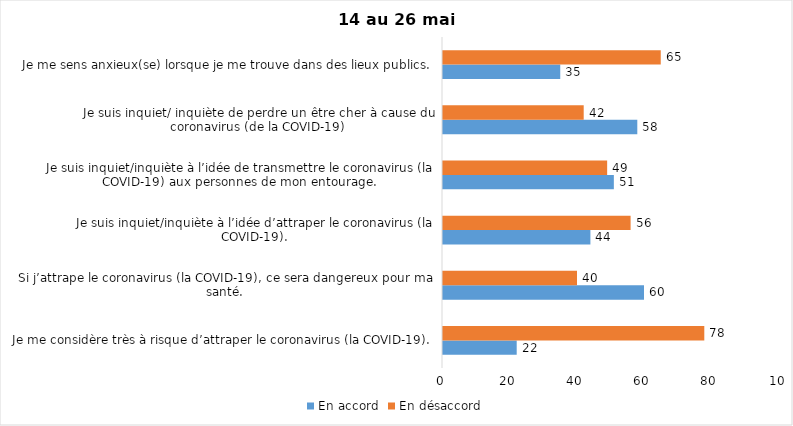
| Category | En accord | En désaccord |
|---|---|---|
| Je me considère très à risque d’attraper le coronavirus (la COVID-19). | 22 | 78 |
| Si j’attrape le coronavirus (la COVID-19), ce sera dangereux pour ma santé. | 60 | 40 |
| Je suis inquiet/inquiète à l’idée d’attraper le coronavirus (la COVID-19). | 44 | 56 |
| Je suis inquiet/inquiète à l’idée de transmettre le coronavirus (la COVID-19) aux personnes de mon entourage. | 51 | 49 |
| Je suis inquiet/ inquiète de perdre un être cher à cause du coronavirus (de la COVID-19) | 58 | 42 |
| Je me sens anxieux(se) lorsque je me trouve dans des lieux publics. | 35 | 65 |